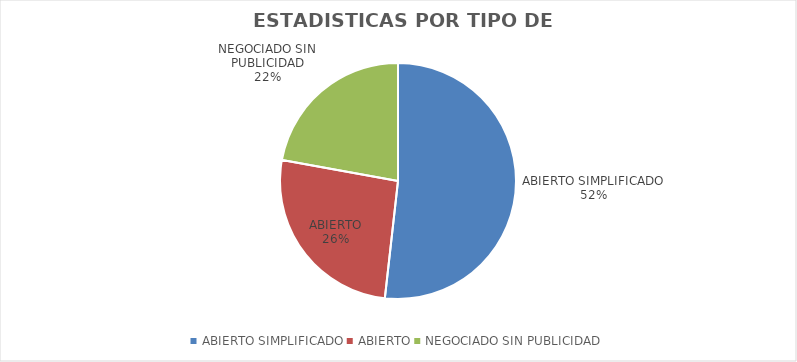
| Category | Series 0 |
|---|---|
| ABIERTO SIMPLIFICADO | 2679915.6 |
| ABIERTO | 1349881.51 |
| NEGOCIADO SIN PUBLICIDAD | 1145865.69 |